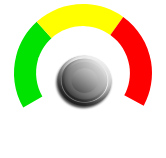
| Category | PIE |
|---|---|
| 0 | 4 |
| 1 | 0.86 |
| 2 | 59.64 |